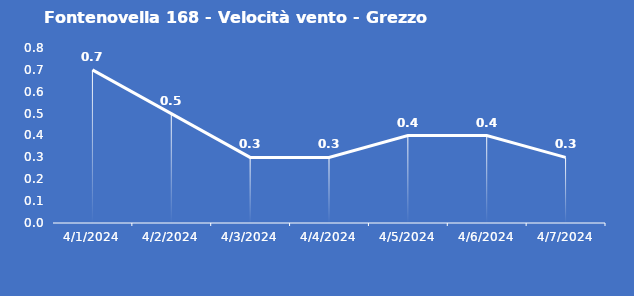
| Category | Fontenovella 168 - Velocità vento - Grezzo (m/s) |
|---|---|
| 4/1/24 | 0.7 |
| 4/2/24 | 0.5 |
| 4/3/24 | 0.3 |
| 4/4/24 | 0.3 |
| 4/5/24 | 0.4 |
| 4/6/24 | 0.4 |
| 4/7/24 | 0.3 |